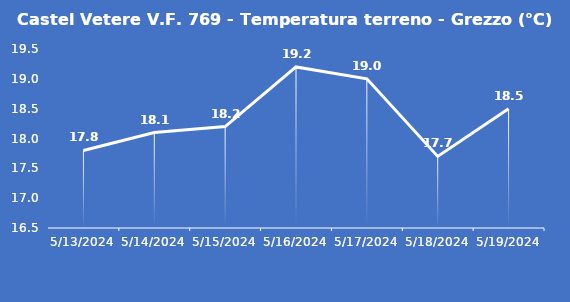
| Category | Castel Vetere V.F. 769 - Temperatura terreno - Grezzo (°C) |
|---|---|
| 5/13/24 | 17.8 |
| 5/14/24 | 18.1 |
| 5/15/24 | 18.2 |
| 5/16/24 | 19.2 |
| 5/17/24 | 19 |
| 5/18/24 | 17.7 |
| 5/19/24 | 18.5 |